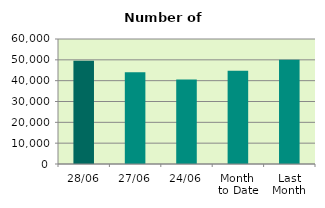
| Category | Series 0 |
|---|---|
| 28/06 | 49582 |
| 27/06 | 44040 |
| 24/06 | 40602 |
| Month 
to Date | 44730.6 |
| Last
Month | 50099.545 |